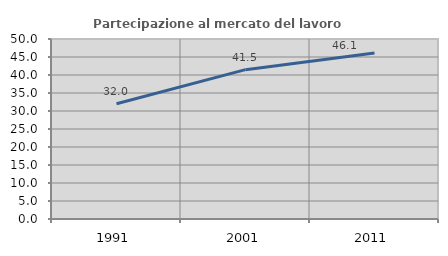
| Category | Partecipazione al mercato del lavoro  femminile |
|---|---|
| 1991.0 | 32.033 |
| 2001.0 | 41.487 |
| 2011.0 | 46.137 |